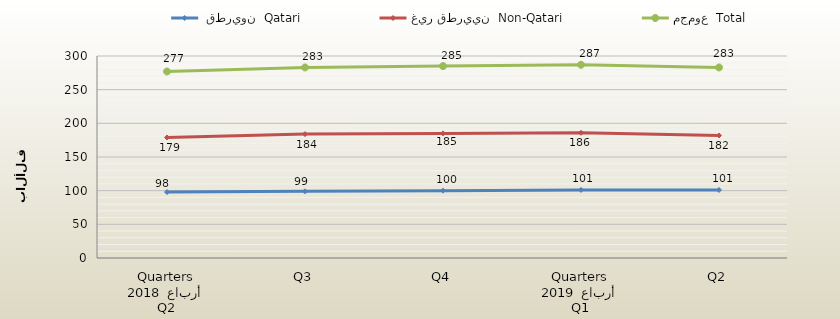
| Category |  قطريون  Qatari | غير قطريين  Non-Qatari | مجموع  Total |
|---|---|---|---|
| 0 | 98 | 179 | 277 |
| 1 | 99 | 184 | 283 |
| 2 | 100 | 185 | 285 |
| 3 | 101 | 186 | 287 |
| 4 | 101 | 182 | 283 |